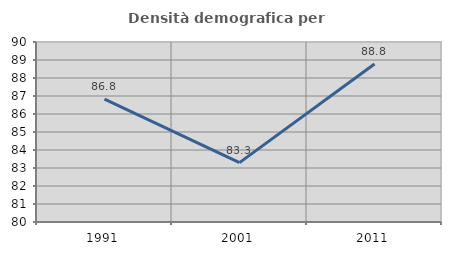
| Category | Densità demografica |
|---|---|
| 1991.0 | 86.832 |
| 2001.0 | 83.3 |
| 2011.0 | 88.78 |